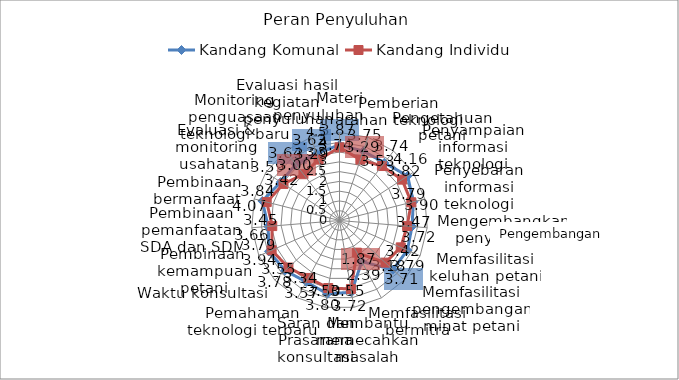
| Category | Kandang Komunal | Kandang Individu |
|---|---|---|
| Materi penyuluhan               | 3.87 | 3.74 |
| Pemberian arahan teknologi | 3.75 | 3.29 |
| Pengetahuan petani | 3.74 | 3.53 |
| Penyampaian informasi teknologi | 4.16 | 3.82 |
| Penyebaran informasi teknologi | 3.9 | 3.79 |
| Mengembangkan penyebaran  | 3.72 | 3.47 |
| Memfasilitasi keluhan petani | 3.79 | 3.42 |
| Memfasilitasi pengembangan minat petani | 3.71 | 3.18 |
| Memfasilitasi bermitra | 2.39 | 1.87 |
| Membantu memecahkan masalah | 3.72 | 3.55 |
| Saran dan Prasarana konsultasi | 3.8 | 3.5 |
| Pemahaman teknologi terbaru | 3.57 | 3.34 |
| Waktu konsultasi | 3.78 | 3.55 |
| Pembinaan  kemampuan petani | 3.94 | 3.79 |
| Pembinaan pemanfaatan SDA dan SDM | 3.66 | 3.45 |
| Pembinaan bermanfaat  | 4.07 | 3.84 |
| Evaluasi & monitoring usahatani | 3.59 | 3.42 |
| Monitoring penguasaan teknologi baru | 3.64 | 3 |
| Evaluasi hasil kegiatan penyuluhan | 3.62 | 3.29 |